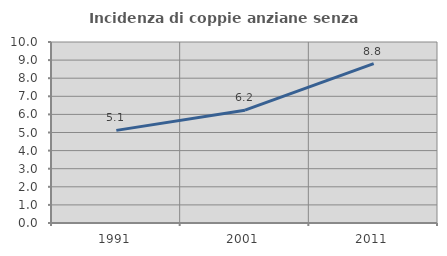
| Category | Incidenza di coppie anziane senza figli  |
|---|---|
| 1991.0 | 5.118 |
| 2001.0 | 6.234 |
| 2011.0 | 8.802 |